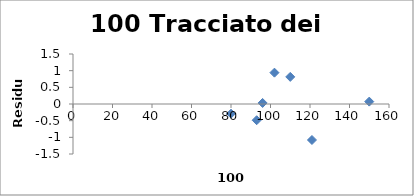
| Category | Series 0 |
|---|---|
| 80.0 | -0.29 |
| 93.0 | -0.487 |
| 102.0 | 0.94 |
| 110.0 | 0.813 |
| 121.0 | -1.08 |
| 96.0 | 0.032 |
| 150.0 | 0.071 |